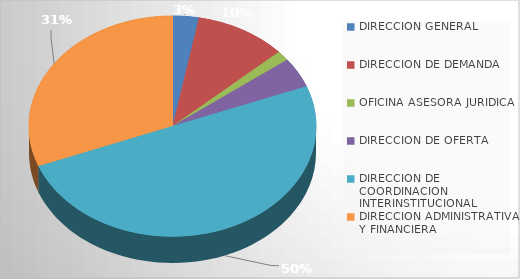
| Category | Series 0 |
|---|---|
| DIRECCION GENERAL | 2 |
| DIRECCION DE DEMANDA | 7 |
| OFICINA ASESORA JURIDICA | 1 |
| DIRECCION DE OFERTA | 3 |
| DIRECCION DE COORDINACION INTERINSTITUCIONAL | 34 |
| DIRECCION ADMINISTRATIVA Y FINANCIERA | 21 |